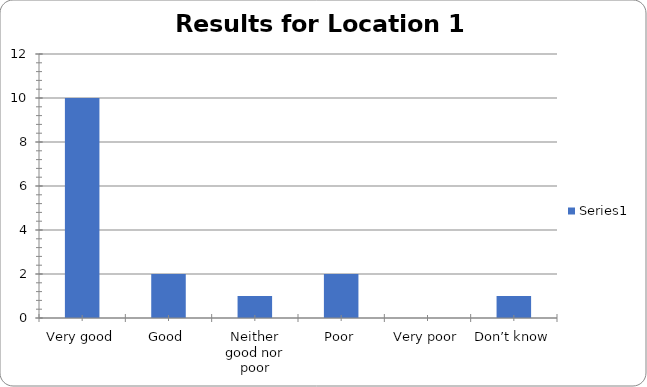
| Category | Series 0 |
|---|---|
| Very good | 10 |
| Good | 2 |
| Neither good nor poor | 1 |
| Poor | 2 |
| Very poor | 0 |
| Don’t know | 1 |